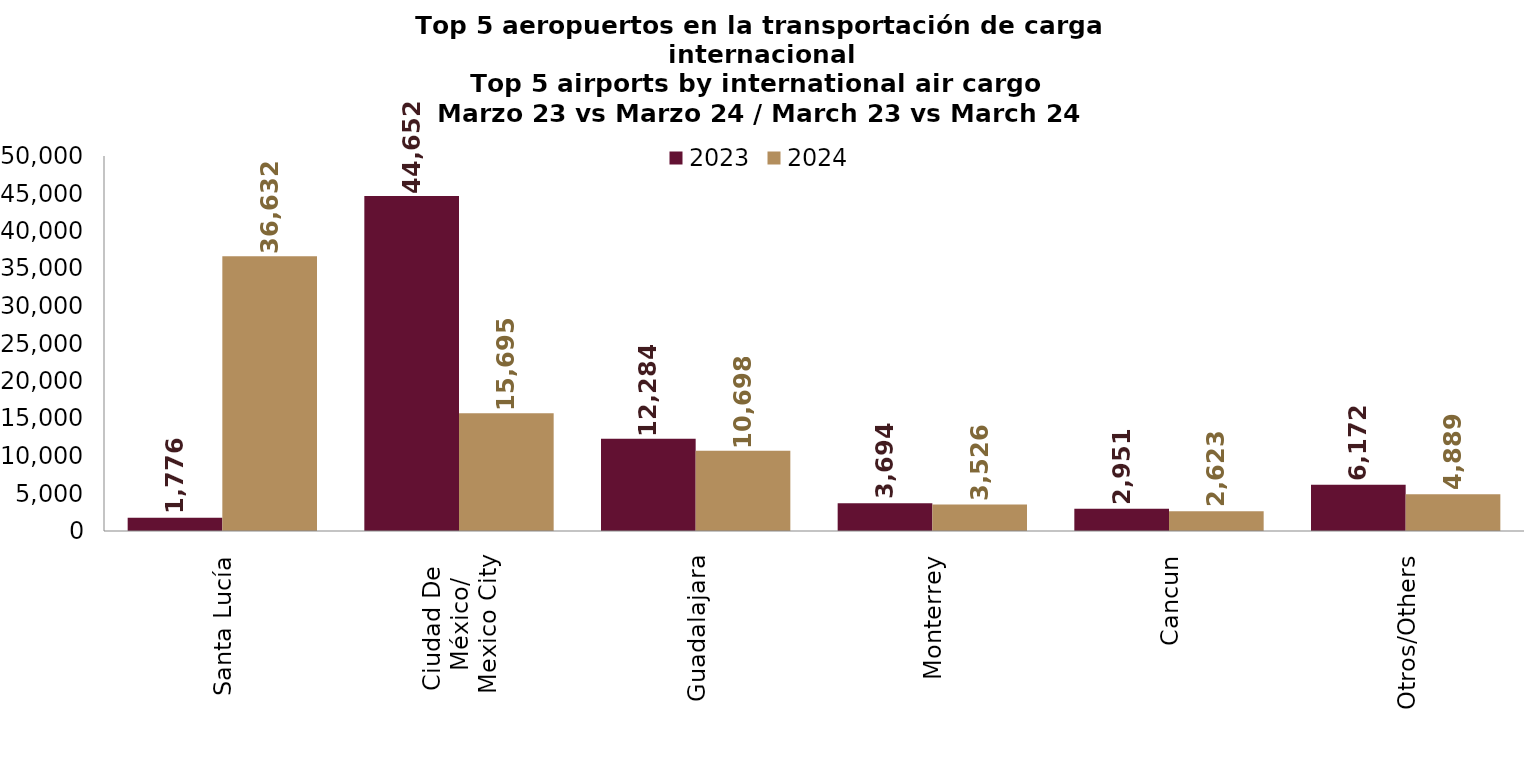
| Category | 2023 | 2024 |
|---|---|---|
| Santa Lucía | 1776.107 | 36631.652 |
| Ciudad De 
México/
Mexico City | 44651.71 | 15695.4 |
| Guadalajara | 12283.563 | 10697.966 |
| Monterrey | 3693.975 | 3525.656 |
| Cancun | 2950.584 | 2622.523 |
| Otros/Others | 6172.014 | 4889.186 |